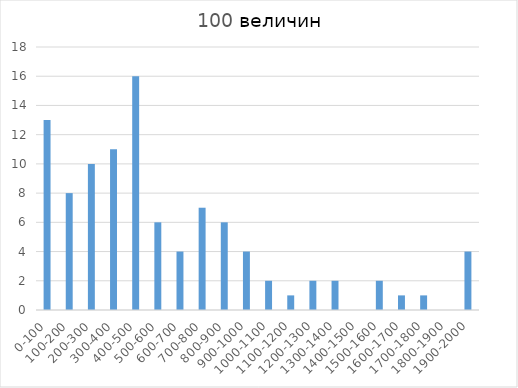
| Category | Series 0 |
|---|---|
| 0-100 | 13 |
| 100-200 | 8 |
| 200-300 | 10 |
| 300-400 | 11 |
| 400-500 | 16 |
| 500-600 | 6 |
| 600-700 | 4 |
| 700-800 | 7 |
| 800-900 | 6 |
| 900-1000 | 4 |
| 1000-1100 | 2 |
| 1100-1200 | 1 |
| 1200-1300 | 2 |
| 1300-1400 | 2 |
| 1400-1500 | 0 |
| 1500-1600 | 2 |
| 1600-1700 | 1 |
| 1700-1800 | 1 |
| 1800-1900 | 0 |
| 1900-2000 | 4 |